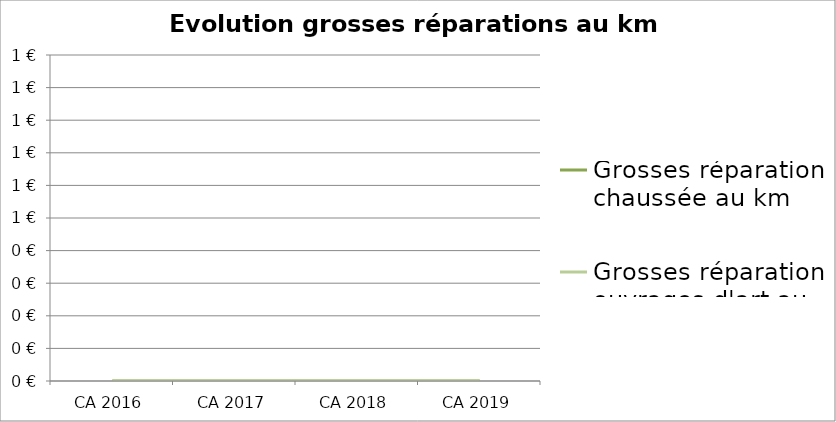
| Category | Grosses réparations chaussée au km | Grosses réparations ouvrages d'art au km |
|---|---|---|
| CA 2016 | 0 | 0 |
| CA 2017 | 0 | 0 |
| CA 2018 | 0 | 0 |
| CA 2019 | 0 | 0 |